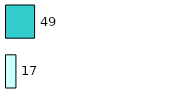
| Category | Series 0 | Series 1 |
|---|---|---|
| 0 | 17 | 49 |